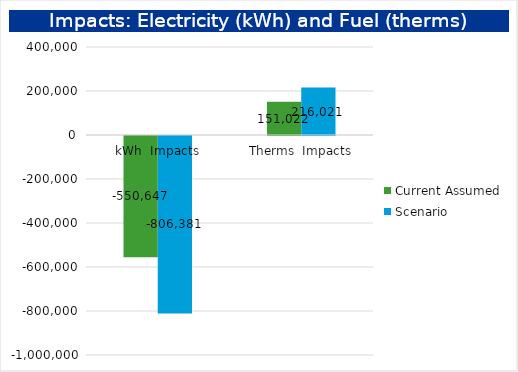
| Category | Current Assumed | Scenario |
|---|---|---|
| kWh  Impacts | -550646.6 | -806380.615 |
| Therms  Impacts | 151021.5 | 216020.535 |